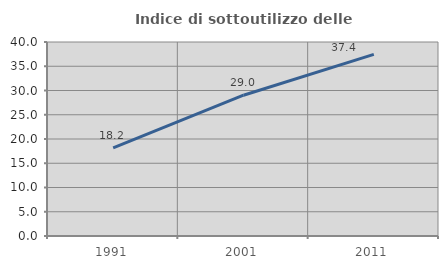
| Category | Indice di sottoutilizzo delle abitazioni  |
|---|---|
| 1991.0 | 18.179 |
| 2001.0 | 29.031 |
| 2011.0 | 37.435 |